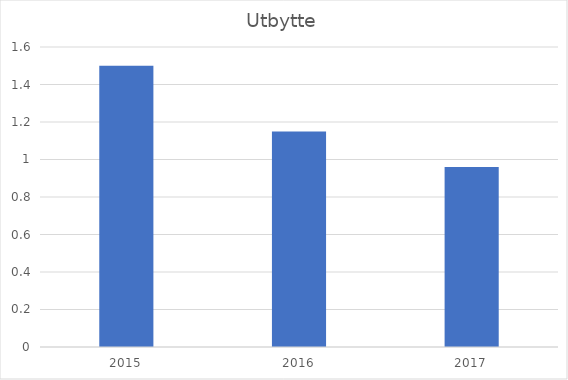
| Category | Utbytte |
|---|---|
| 2015.0 | 1.5 |
| 2016.0 | 1.15 |
| 2017.0 | 0.96 |